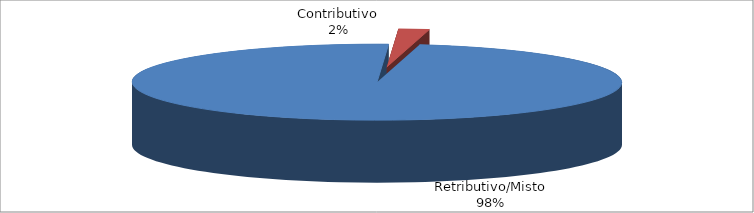
| Category | Series 1 |
|---|---|
| Retributivo/Misto | 35671 |
| Contributivo | 737 |